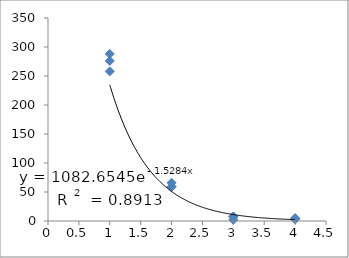
| Category | Series 0 |
|---|---|
| 1.0 | 288 |
| 1.0 | 258 |
| 1.0 | 276 |
| 2.0 | 59 |
| 2.0 | 66 |
| 2.0 | 59 |
| 3.0 | 8 |
| 3.0 | 7 |
| 3.0 | 2 |
| 4.0 | 4 |
| 4.0 | 3 |
| 4.0 | 5 |